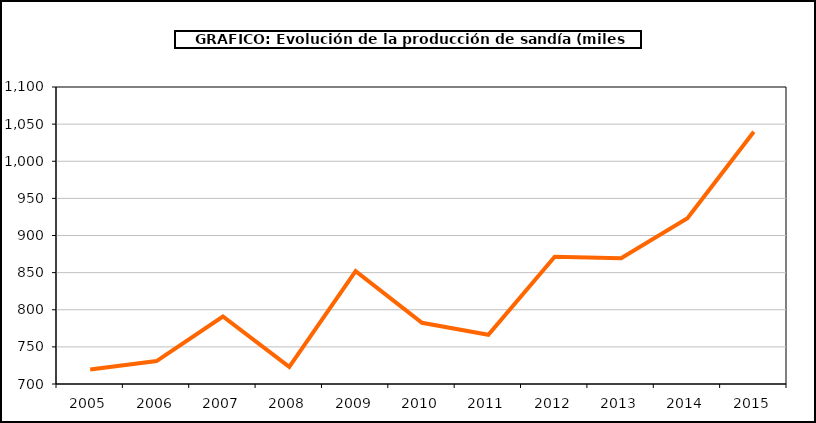
| Category | producción |
|---|---|
| 2005.0 | 719.621 |
| 2006.0 | 730.902 |
| 2007.0 | 790.947 |
| 2008.0 | 723.164 |
| 2009.0 | 851.976 |
| 2010.0 | 782.43 |
| 2011.0 | 766.301 |
| 2012.0 | 871.324 |
| 2013.0 | 869.499 |
| 2014.0 | 923.32 |
| 2015.0 | 1039.698 |